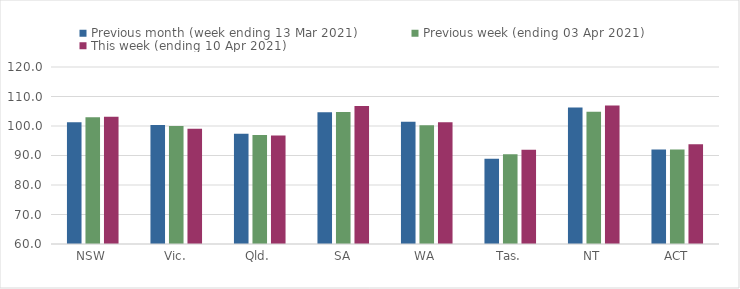
| Category | Previous month (week ending 13 Mar 2021) | Previous week (ending 03 Apr 2021) | This week (ending 10 Apr 2021) |
|---|---|---|---|
| NSW | 101.31 | 102.93 | 103.17 |
| Vic. | 100.38 | 100 | 99.09 |
| Qld. | 97.4 | 96.93 | 96.76 |
| SA | 104.66 | 104.77 | 106.76 |
| WA | 101.47 | 100.25 | 101.28 |
| Tas. | 88.92 | 90.41 | 91.92 |
| NT | 106.31 | 104.85 | 106.95 |
| ACT | 92 | 92 | 93.84 |